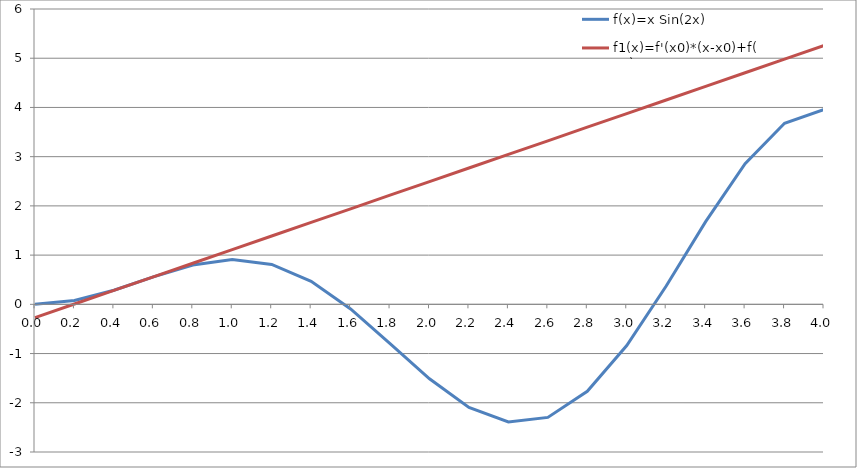
| Category | f(x)=x Sin(2x) | f1(x)=f'(x0)*(x-x0)+f(x0) |
|---|---|---|
| 0.0 | 0 | -0.27 |
| 0.2 | 0.078 | 0.006 |
| 0.4 | 0.287 | 0.283 |
| 0.6000000000000001 | 0.559 | 0.559 |
| 0.8 | 0.8 | 0.835 |
| 1.0 | 0.909 | 1.112 |
| 1.2 | 0.811 | 1.388 |
| 1.4 | 0.469 | 1.664 |
| 1.5999999999999999 | -0.093 | 1.941 |
| 1.7999999999999998 | -0.797 | 2.217 |
| 1.9999999999999998 | -1.514 | 2.493 |
| 2.1999999999999997 | -2.094 | 2.77 |
| 2.4 | -2.391 | 3.046 |
| 2.6 | -2.297 | 3.322 |
| 2.8000000000000003 | -1.768 | 3.599 |
| 3.0000000000000004 | -0.838 | 3.875 |
| 3.2000000000000006 | 0.373 | 4.152 |
| 3.400000000000001 | 1.68 | 4.428 |
| 3.600000000000001 | 2.857 | 4.704 |
| 3.800000000000001 | 3.678 | 4.981 |
| 4.000000000000001 | 3.957 | 5.257 |